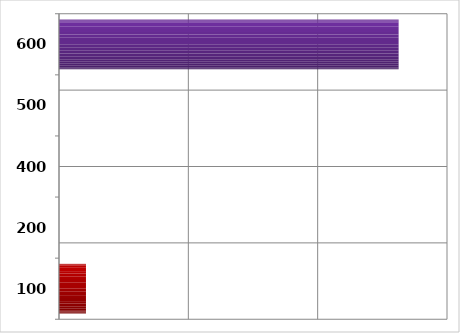
| Category | Series 0 |
|---|---|
| 100.0 | 417032.05 |
| 200.0 | 0 |
| 400.0 | 0 |
| 500.0 | 0 |
| 600.0 | 5251753.18 |